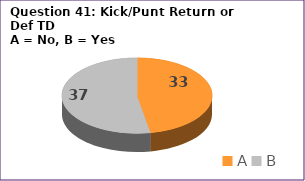
| Category | Series 0 |
|---|---|
| A | 33 |
| B | 37 |